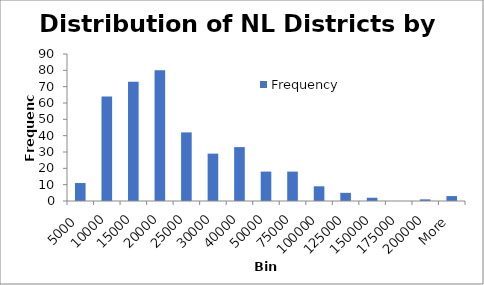
| Category | Frequency |
|---|---|
| 5000 | 11 |
| 10000 | 64 |
| 15000 | 73 |
| 20000 | 80 |
| 25000 | 42 |
| 30000 | 29 |
| 40000 | 33 |
| 50000 | 18 |
| 75000 | 18 |
| 100000 | 9 |
| 125000 | 5 |
| 150000 | 2 |
| 175000 | 0 |
| 200000 | 1 |
| More | 3 |